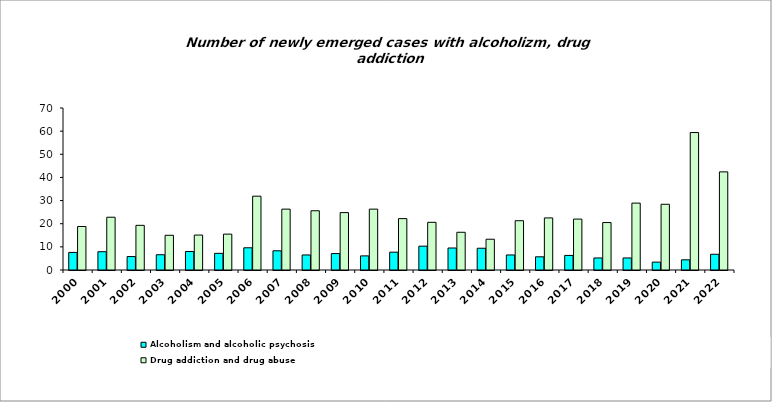
| Category | Alcoholism and alcoholic psychosis                                                                                                                                                                     | Drug addiction and drug abuse                                                                                                                                                                |
|---|---|---|
| 2000.0 | 7.6 | 18.8 |
| 2001.0 | 7.9 | 22.8 |
| 2002.0 | 5.8 | 19.3 |
| 2003.0 | 6.6 | 15 |
| 2004.0 | 8 | 15.1 |
| 2005.0 | 7.2 | 15.5 |
| 2006.0 | 9.6 | 31.9 |
| 2007.0 | 8.3 | 26.3 |
| 2008.0 | 6.5 | 25.6 |
| 2009.0 | 7.1 | 24.8 |
| 2010.0 | 6.1 | 26.3 |
| 2011.0 | 7.7 | 22.2 |
| 2012.0 | 10.3 | 20.6 |
| 2013.0 | 9.5 | 16.3 |
| 2014.0 | 9.4 | 13.3 |
| 2015.0 | 6.496 | 21.3 |
| 2016.0 | 5.7 | 22.5 |
| 2017.0 | 6.3 | 22 |
| 2018.0 | 5.2 | 20.5 |
| 2019.0 | 5.2 | 28.9 |
| 2020.0 | 3.4 | 28.4 |
| 2021.0 | 4.4 | 59.4 |
| 2022.0 | 6.8 | 42.4 |